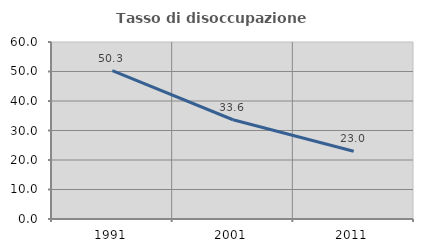
| Category | Tasso di disoccupazione giovanile  |
|---|---|
| 1991.0 | 50.331 |
| 2001.0 | 33.645 |
| 2011.0 | 22.951 |